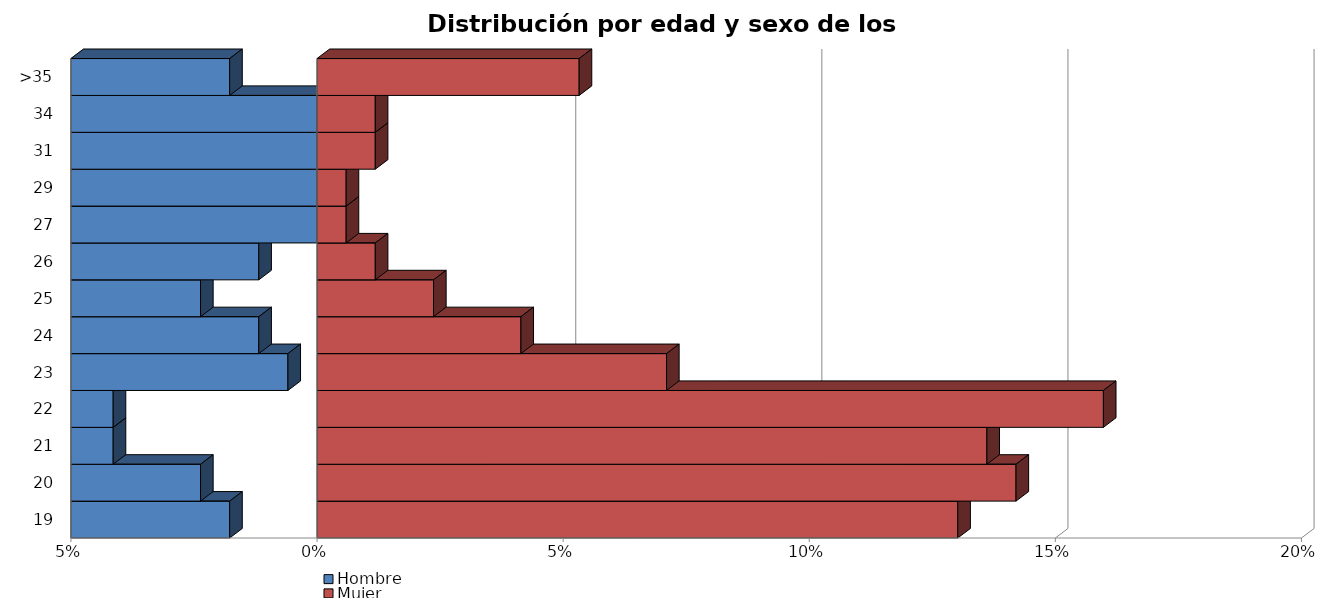
| Category | Hombre | Mujer |
|---|---|---|
| 19 | -0.018 | 0.13 |
| 20 | -0.024 | 0.142 |
| 21 | -0.041 | 0.136 |
| 22 | -0.041 | 0.16 |
| 23 | -0.006 | 0.071 |
| 24 | -0.012 | 0.041 |
| 25 | -0.024 | 0.024 |
| 26 | -0.012 | 0.012 |
| 27 | 0 | 0.006 |
| 29 | 0 | 0.006 |
| 31 | 0 | 0.012 |
| 34 | 0 | 0.012 |
| >35 | -0.018 | 0.053 |